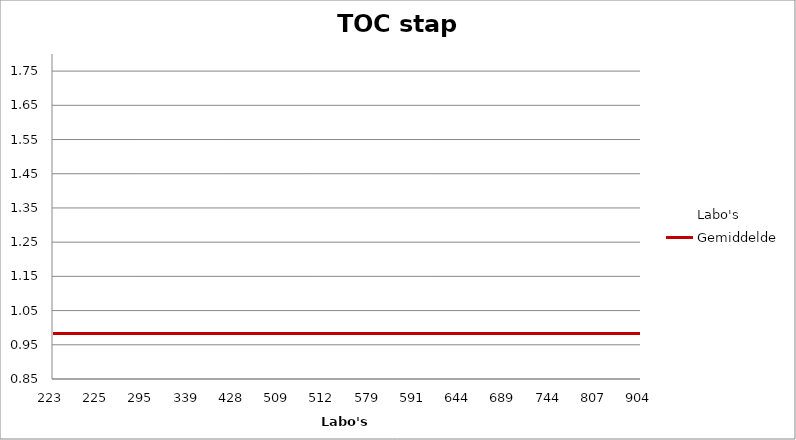
| Category | Labo's | Gemiddelde |
|---|---|---|
| 223.0 | 0.97 | 0.983 |
| 225.0 | 0.9 | 0.983 |
| 295.0 | 0.99 | 0.983 |
| 339.0 | 1.77 | 0.983 |
| 428.0 | 1 | 0.983 |
| 509.0 | 0.98 | 0.983 |
| 512.0 | 1.01 | 0.983 |
| 579.0 | 0.97 | 0.983 |
| 591.0 | 0.93 | 0.983 |
| 644.0 | 1.01 | 0.983 |
| 689.0 | 0.95 | 0.983 |
| 744.0 | 1.04 | 0.983 |
| 807.0 | 1 | 0.983 |
| 904.0 | 1.01 | 0.983 |